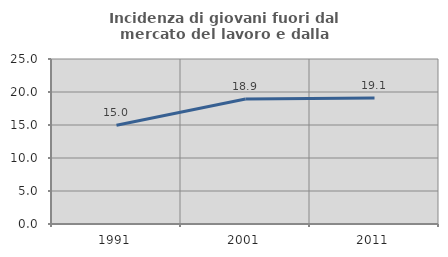
| Category | Incidenza di giovani fuori dal mercato del lavoro e dalla formazione  |
|---|---|
| 1991.0 | 14.966 |
| 2001.0 | 18.925 |
| 2011.0 | 19.107 |